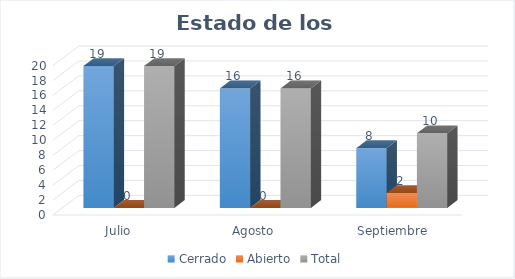
| Category | Cerrado | Abierto | Total |
|---|---|---|---|
| Julio  | 19 | 0 | 19 |
| Agosto  | 16 | 0 | 16 |
| Septiembre | 8 | 2 | 10 |